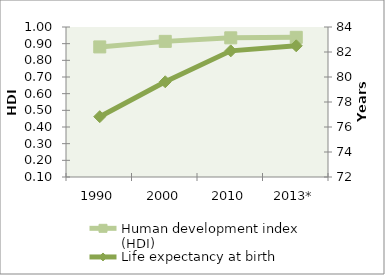
| Category | Human development index (HDI) |
|---|---|
| 1990 | 0.88 |
| 2000 | 0.914 |
| 2010 | 0.935 |
| 2013* | 0.938 |